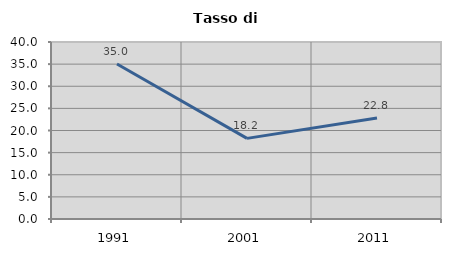
| Category | Tasso di disoccupazione   |
|---|---|
| 1991.0 | 35.013 |
| 2001.0 | 18.22 |
| 2011.0 | 22.813 |